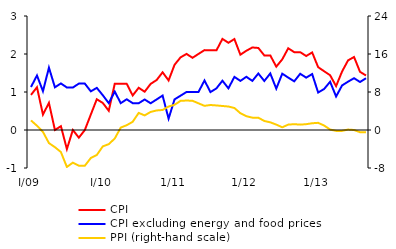
| Category | CPI | CPI excluding energy and food prices |
|---|---|---|
| I/09 | 0.924 | 1.132 |
| 2 | 1.125 | 1.434 |
| 3 | 0.407 | 1.021 |
| 4 | 0.714 | 1.641 |
| 5 | 0 | 1.124 |
| 6 | 0.101 | 1.226 |
| 7 | -0.503 | 1.118 |
| 8 | 0 | 1.117 |
| 9 | -0.202 | 1.221 |
| 10 | 0 | 1.221 |
| 11 | 0.407 | 1.017 |
| 12 | 0.81 | 1.109 |
| I/10 | 0.712 | 0.916 |
| 2 | 0.506 | 0.707 |
| 3 | 1.216 | 1.011 |
| 4 | 1.215 | 0.706 |
| 5 | 1.216 | 0.808 |
| 6 | 0.909 | 0.706 |
| 7 | 1.111 | 0.704 |
| 8 | 1.008 | 0.803 |
| 9 | 1.213 | 0.704 |
| 10 | 1.314 | 0.804 |
| 11 | 1.518 | 0.906 |
| 12 | 1.305 | 0.299 |
| 1/11 | 1.717 | 0.806 |
| 2 | 1.911 | 0.903 |
| 3 | 2.002 | 1.001 |
| 4 | 1.9 | 1.002 |
| 5 | 2.002 | 1.002 |
| 6 | 2.102 | 1.303 |
| 7 | 2.098 | 0.998 |
| 8 | 2.096 | 1.096 |
| 9 | 2.398 | 1.297 |
| 10 | 2.295 | 1.097 |
| 11 | 2.393 | 1.397 |
| 12 | 1.982 | 1.292 |
| 1/12 | 2.085 | 1.4 |
| 2 | 2.172 | 1.292 |
| 3 | 2.159 | 1.487 |
| 4 | 1.963 | 1.29 |
| 5 | 1.963 | 1.488 |
| 6 | 1.667 | 1.088 |
| 7 | 1.859 | 1.482 |
| 8 | 2.151 | 1.379 |
| 9 | 2.049 | 1.281 |
| 10 | 2.049 | 1.479 |
| 11 | 1.947 | 1.378 |
| 12 | 2.041 | 1.472 |
| 1/13 | 1.654 | 0.986 |
| 2 | 1.546 | 1.079 |
| 3 | 1.441 | 1.27 |
| 4 | 1.155 | 0.881 |
| 5 | 1.54 | 1.173 |
| 6 | 1.832 | 1.272 |
| 7 | 1.921 | 1.363 |
| 8 | 1.531 | 1.263 |
| 9 | 1.434 | 1.362 |